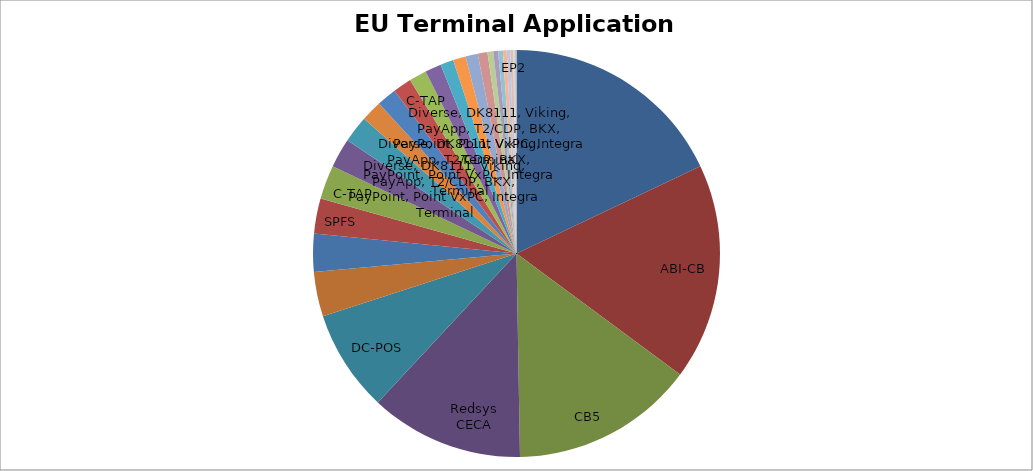
| Category | EU Terminals |
|---|---|
|  | 1653.91 |
| ABI-CB | 1584.19 |
| CB5 | 1344.4 |
| Redsys
CECA | 1125.05 |
| DC-POS | 743.62 |
|  | 326.35 |
|  | 279.16 |
| SPFS | 256.49 |
| C-TAP | 249.19 |
| Diverse, DK8111, Viking, PayApp, T2/CDP, BKX, PayPoint, Point VxPC, Integra Terminal | 214.71 |
| Diverse, DK8111, Viking, PayApp, T2/CDP, BKX, PayPoint, Point VxPC, Integra Terminal | 196 |
|  | 154.16 |
| Diverse, DK8111, Viking, PayApp, T2/CDP, BKX, PayPoint, Point VxPC, Integra Terminal | 144.98 |
| C-TAP | 136.25 |
|  | 128.04 |
|  | 118.75 |
|  | 95.72 |
|  | 92.22 |
|  | 90.8 |
|  | 70.75 |
|  | 41.89 |
|  | 35.59 |
|  | 34.64 |
|  | 27.46 |
|  | 25.92 |
|  | 21.49 |
|  | 11.98 |
| EP2 | 11.61 |